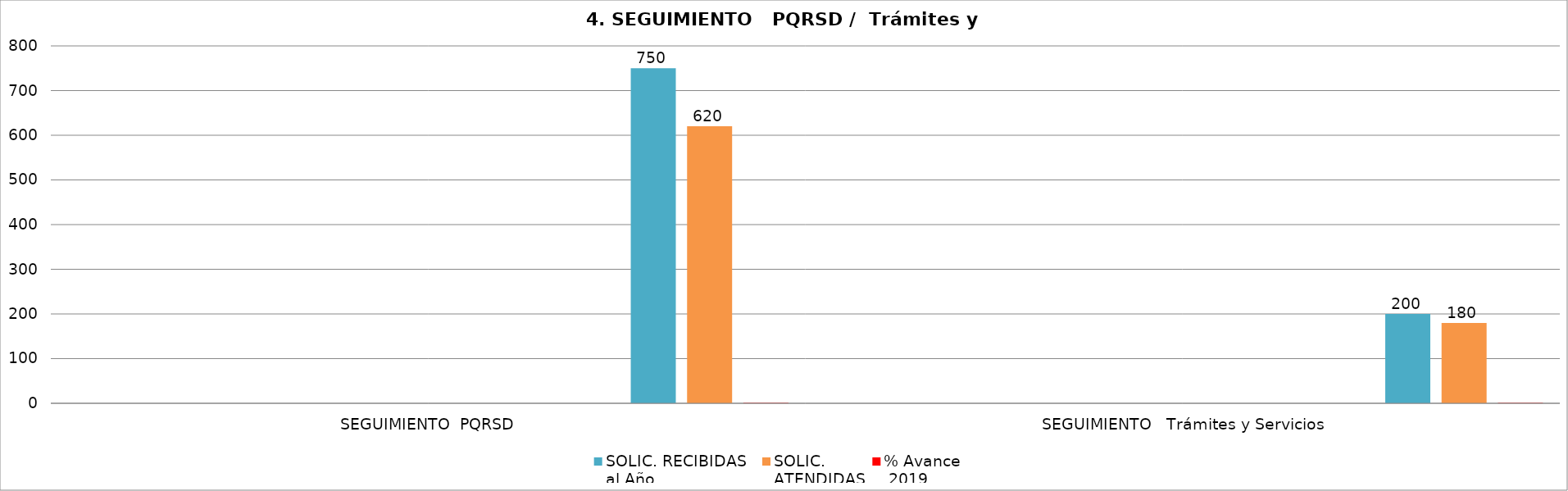
| Category | Series 0 | Series 1 | Series 2 | Series 3 | Series 4 | Series 5 | Series 6 | Series 7 | Series 8 | Series 9 | SOLIC. RECIBIDAS
al Año | SOLIC. 
ATENDIDAS | % Avance
 2019 |
|---|---|---|---|---|---|---|---|---|---|---|---|---|---|
| SEGUIMIENTO  PQRSD |  |  |  |  |  |  |  |  |  |  | 750 | 620 | 0.827 |
| SEGUIMIENTO   Trámites y Servicios |  |  |  |  |  |  |  |  |  |  | 200 | 180 | 0.9 |